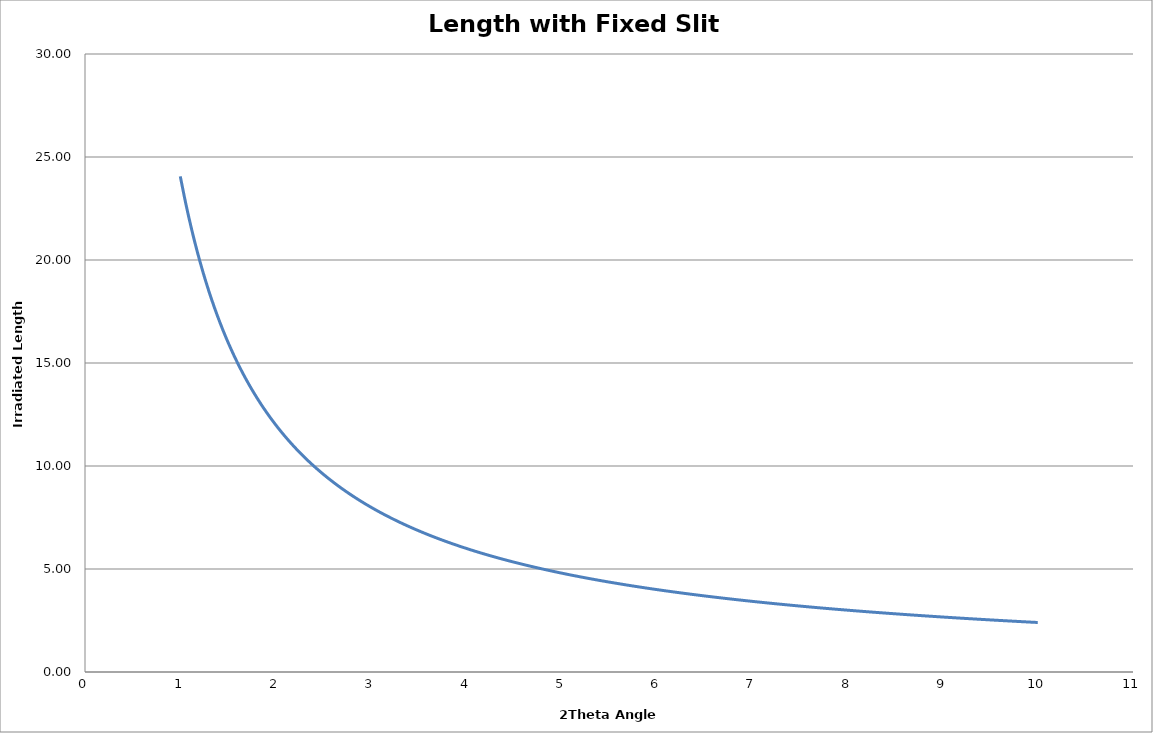
| Category | Length with Fixed Slit (mm) |
|---|---|
| 1.0 | 24.06 |
| 1.06 | 22.692 |
| 1.12 | 21.472 |
| 1.1800000000000002 | 20.376 |
| 1.2400000000000002 | 19.387 |
| 1.3000000000000003 | 18.489 |
| 1.3600000000000003 | 17.671 |
| 1.4200000000000004 | 16.923 |
| 1.4800000000000004 | 16.235 |
| 1.5400000000000005 | 15.601 |
| 1.6000000000000005 | 15.015 |
| 1.6600000000000006 | 14.471 |
| 1.7200000000000006 | 13.966 |
| 1.7800000000000007 | 13.494 |
| 1.8400000000000007 | 13.054 |
| 1.9000000000000008 | 12.641 |
| 1.9600000000000009 | 12.253 |
| 2.020000000000001 | 11.889 |
| 2.080000000000001 | 11.546 |
| 2.140000000000001 | 11.222 |
| 2.200000000000001 | 10.915 |
| 2.260000000000001 | 10.625 |
| 2.320000000000001 | 10.35 |
| 2.3800000000000012 | 10.089 |
| 2.4400000000000013 | 9.841 |
| 2.5000000000000013 | 9.605 |
| 2.5600000000000014 | 9.379 |
| 2.6200000000000014 | 9.164 |
| 2.6800000000000015 | 8.959 |
| 2.7400000000000015 | 8.763 |
| 2.8000000000000016 | 8.575 |
| 2.8600000000000017 | 8.395 |
| 2.9200000000000017 | 8.222 |
| 2.9800000000000018 | 8.057 |
| 3.040000000000002 | 7.898 |
| 3.100000000000002 | 7.745 |
| 3.160000000000002 | 7.598 |
| 3.220000000000002 | 7.456 |
| 3.280000000000002 | 7.32 |
| 3.340000000000002 | 7.188 |
| 3.400000000000002 | 7.061 |
| 3.460000000000002 | 6.939 |
| 3.5200000000000022 | 6.821 |
| 3.5800000000000023 | 6.706 |
| 3.6400000000000023 | 6.596 |
| 3.7000000000000024 | 6.489 |
| 3.7600000000000025 | 6.385 |
| 3.8200000000000025 | 6.285 |
| 3.8800000000000026 | 6.188 |
| 3.9400000000000026 | 6.094 |
| 4.000000000000003 | 6.002 |
| 4.060000000000002 | 5.913 |
| 4.120000000000002 | 5.827 |
| 4.1800000000000015 | 5.744 |
| 4.240000000000001 | 5.662 |
| 4.300000000000001 | 5.583 |
| 4.36 | 5.507 |
| 4.42 | 5.432 |
| 4.4799999999999995 | 5.359 |
| 4.539999999999999 | 5.288 |
| 4.599999999999999 | 5.219 |
| 4.659999999999998 | 5.152 |
| 4.719999999999998 | 5.087 |
| 4.779999999999998 | 5.023 |
| 4.839999999999997 | 4.961 |
| 4.899999999999997 | 4.9 |
| 4.959999999999996 | 4.841 |
| 5.019999999999996 | 4.783 |
| 5.079999999999996 | 4.726 |
| 5.139999999999995 | 4.671 |
| 5.199999999999995 | 4.617 |
| 5.2599999999999945 | 4.565 |
| 5.319999999999994 | 4.513 |
| 5.379999999999994 | 4.463 |
| 5.439999999999993 | 4.414 |
| 5.499999999999993 | 4.366 |
| 5.5599999999999925 | 4.319 |
| 5.619999999999992 | 4.273 |
| 5.679999999999992 | 4.227 |
| 5.739999999999991 | 4.183 |
| 5.799999999999991 | 4.14 |
| 5.8599999999999905 | 4.098 |
| 5.91999999999999 | 4.056 |
| 5.97999999999999 | 4.015 |
| 6.039999999999989 | 3.976 |
| 6.099999999999989 | 3.937 |
| 6.159999999999989 | 3.898 |
| 6.219999999999988 | 3.861 |
| 6.279999999999988 | 3.824 |
| 6.339999999999987 | 3.788 |
| 6.399999999999987 | 3.752 |
| 6.459999999999987 | 3.717 |
| 6.519999999999986 | 3.683 |
| 6.579999999999986 | 3.65 |
| 6.6399999999999855 | 3.617 |
| 6.699999999999985 | 3.584 |
| 6.759999999999985 | 3.553 |
| 6.819999999999984 | 3.521 |
| 6.879999999999984 | 3.491 |
| 6.9399999999999835 | 3.461 |
| 6.999999999999983 | 3.431 |
| 7.059999999999983 | 3.402 |
| 7.119999999999982 | 3.373 |
| 7.179999999999982 | 3.345 |
| 7.239999999999982 | 3.317 |
| 7.299999999999981 | 3.29 |
| 7.359999999999981 | 3.263 |
| 7.41999999999998 | 3.237 |
| 7.47999999999998 | 3.211 |
| 7.53999999999998 | 3.185 |
| 7.599999999999979 | 3.16 |
| 7.659999999999979 | 3.136 |
| 7.719999999999978 | 3.111 |
| 7.779999999999978 | 3.087 |
| 7.839999999999978 | 3.064 |
| 7.899999999999977 | 3.041 |
| 7.959999999999977 | 3.018 |
| 8.019999999999976 | 2.995 |
| 8.079999999999977 | 2.973 |
| 8.139999999999977 | 2.951 |
| 8.199999999999978 | 2.929 |
| 8.259999999999978 | 2.908 |
| 8.319999999999979 | 2.887 |
| 8.37999999999998 | 2.867 |
| 8.43999999999998 | 2.846 |
| 8.49999999999998 | 2.826 |
| 8.559999999999981 | 2.806 |
| 8.619999999999981 | 2.787 |
| 8.679999999999982 | 2.768 |
| 8.739999999999982 | 2.749 |
| 8.799999999999983 | 2.73 |
| 8.859999999999983 | 2.712 |
| 8.919999999999984 | 2.693 |
| 8.979999999999984 | 2.675 |
| 9.039999999999985 | 2.658 |
| 9.099999999999985 | 2.64 |
| 9.159999999999986 | 2.623 |
| 9.219999999999986 | 2.606 |
| 9.279999999999987 | 2.589 |
| 9.339999999999987 | 2.573 |
| 9.399999999999988 | 2.556 |
| 9.459999999999988 | 2.54 |
| 9.519999999999989 | 2.524 |
| 9.57999999999999 | 2.508 |
| 9.63999999999999 | 2.493 |
| 9.69999999999999 | 2.477 |
| 9.759999999999991 | 2.462 |
| 9.819999999999991 | 2.447 |
| 9.879999999999992 | 2.432 |
| 9.939999999999992 | 2.418 |
| 9.999999999999993 | 2.403 |